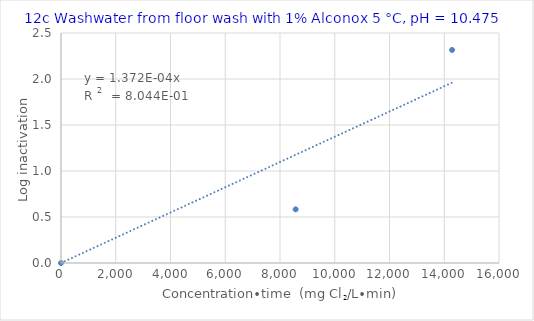
| Category | Series 0 |
|---|---|
| 0.0 | 0 |
| 8571.428571428572 | 0.583 |
| 14285.714285714286 | 2.316 |